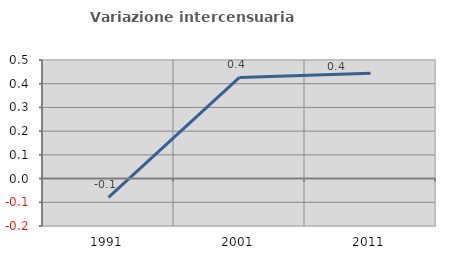
| Category | Variazione intercensuaria annua |
|---|---|
| 1991.0 | -0.079 |
| 2001.0 | 0.426 |
| 2011.0 | 0.445 |